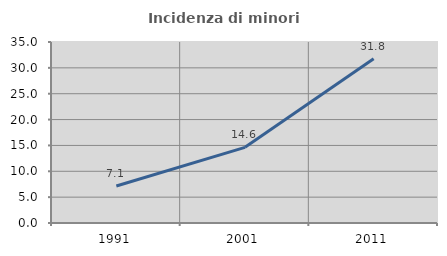
| Category | Incidenza di minori stranieri |
|---|---|
| 1991.0 | 7.143 |
| 2001.0 | 14.634 |
| 2011.0 | 31.765 |